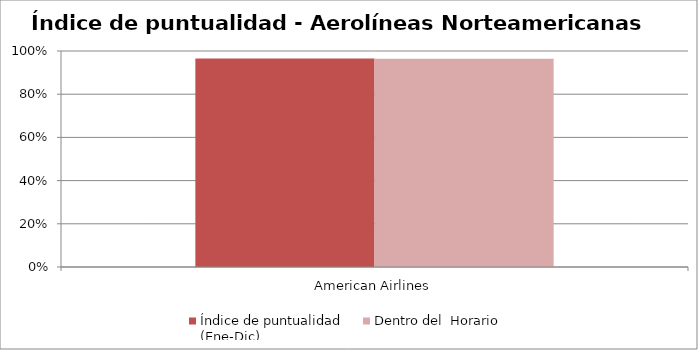
| Category | Índice de puntualidad
(Ene-Dic) | Dentro del  Horario |
|---|---|---|
| American Airlines | 0.966 | 0.964 |